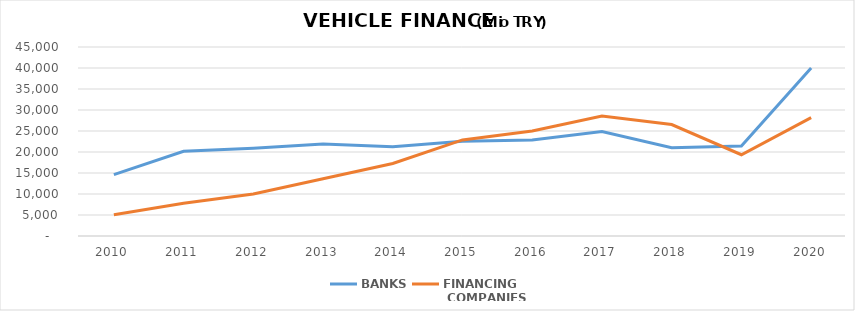
| Category | BANKS | FINANCING
 COMPANIES |
|---|---|---|
| 2010 | 14596 | 5035.89 |
| 2011 | 20160 | 7796.854 |
| 2012 | 20919 | 10009.755 |
| 2013 | 21906 | 13616.036 |
| 2014 | 21245 | 17271.844 |
| 2015 | 22567 | 22875.563 |
| 2016 | 22835 | 24980.231 |
| 2017 | 24852 | 28584.938 |
| 2018 | 21028 | 26527.133 |
| 2019 | 21426.2 | 19352.327 |
| 2020 | 40002.96 | 28176.3 |